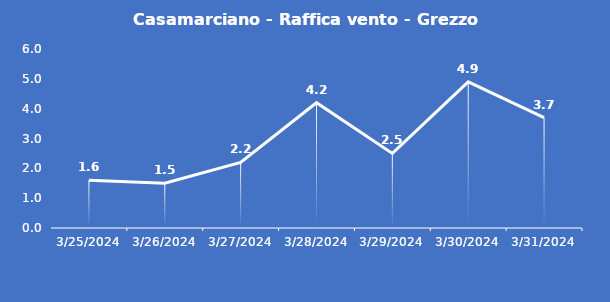
| Category | Casamarciano - Raffica vento - Grezzo (m/s) |
|---|---|
| 3/25/24 | 1.6 |
| 3/26/24 | 1.5 |
| 3/27/24 | 2.2 |
| 3/28/24 | 4.2 |
| 3/29/24 | 2.5 |
| 3/30/24 | 4.9 |
| 3/31/24 | 3.7 |